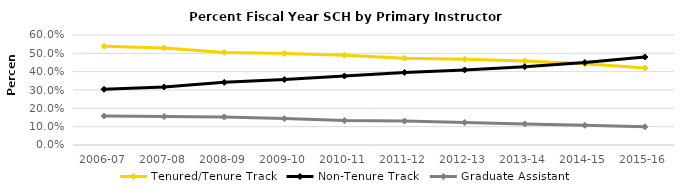
| Category | Tenured/Tenure Track | Non-Tenure Track | Graduate Assistant |
|---|---|---|---|
| 2006-07 | 0.538 | 0.304 | 0.158 |
| 2007-08 | 0.529 | 0.316 | 0.155 |
| 2008-09 | 0.505 | 0.342 | 0.153 |
| 2009-10 | 0.499 | 0.357 | 0.144 |
| 2010-11 | 0.49 | 0.376 | 0.133 |
| 2011-12 | 0.473 | 0.396 | 0.131 |
| 2012-13 | 0.468 | 0.41 | 0.123 |
| 2013-14 | 0.458 | 0.427 | 0.115 |
| 2014-15 | 0.443 | 0.45 | 0.107 |
| 2015-16 | 0.42 | 0.48 | 0.1 |